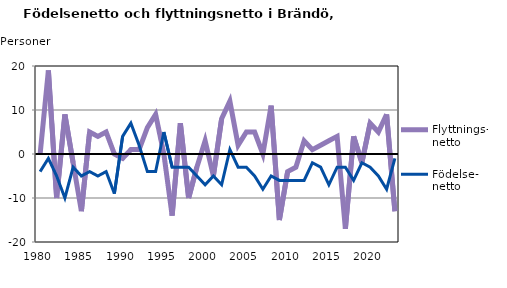
| Category | Flyttnings- netto | Födelse- netto |
|---|---|---|
| 1980.0 | 0 | -4 |
| 1981.0 | 19 | -1 |
| 1982.0 | -10 | -5 |
| 1983.0 | 9 | -10 |
| 1984.0 | -2 | -3 |
| 1985.0 | -13 | -5 |
| 1986.0 | 5 | -4 |
| 1987.0 | 4 | -5 |
| 1988.0 | 5 | -4 |
| 1989.0 | 0 | -9 |
| 1990.0 | -1 | 4 |
| 1991.0 | 1 | 7 |
| 1992.0 | 1 | 2 |
| 1993.0 | 6 | -4 |
| 1994.0 | 9 | -4 |
| 1995.0 | 0 | 5 |
| 1996.0 | -14 | -3 |
| 1997.0 | 7 | -3 |
| 1998.0 | -10 | -3 |
| 1999.0 | -3 | -5 |
| 2000.0 | 3 | -7 |
| 2001.0 | -5 | -5 |
| 2002.0 | 8 | -7 |
| 2003.0 | 12 | 1 |
| 2004.0 | 2 | -3 |
| 2005.0 | 5 | -3 |
| 2006.0 | 5 | -5 |
| 2007.0 | 0 | -8 |
| 2008.0 | 11 | -5 |
| 2009.0 | -15 | -6 |
| 2010.0 | -4 | -6 |
| 2011.0 | -3 | -6 |
| 2012.0 | 3 | -6 |
| 2013.0 | 1 | -2 |
| 2014.0 | 2 | -3 |
| 2015.0 | 3 | -7 |
| 2016.0 | 4 | -3 |
| 2017.0 | -17 | -3 |
| 2018.0 | 4 | -6 |
| 2019.0 | -2 | -2 |
| 2020.0 | 7 | -3 |
| 2021.0 | 5 | -5 |
| 2022.0 | 9 | -8 |
| 2023.0 | -13 | -1 |